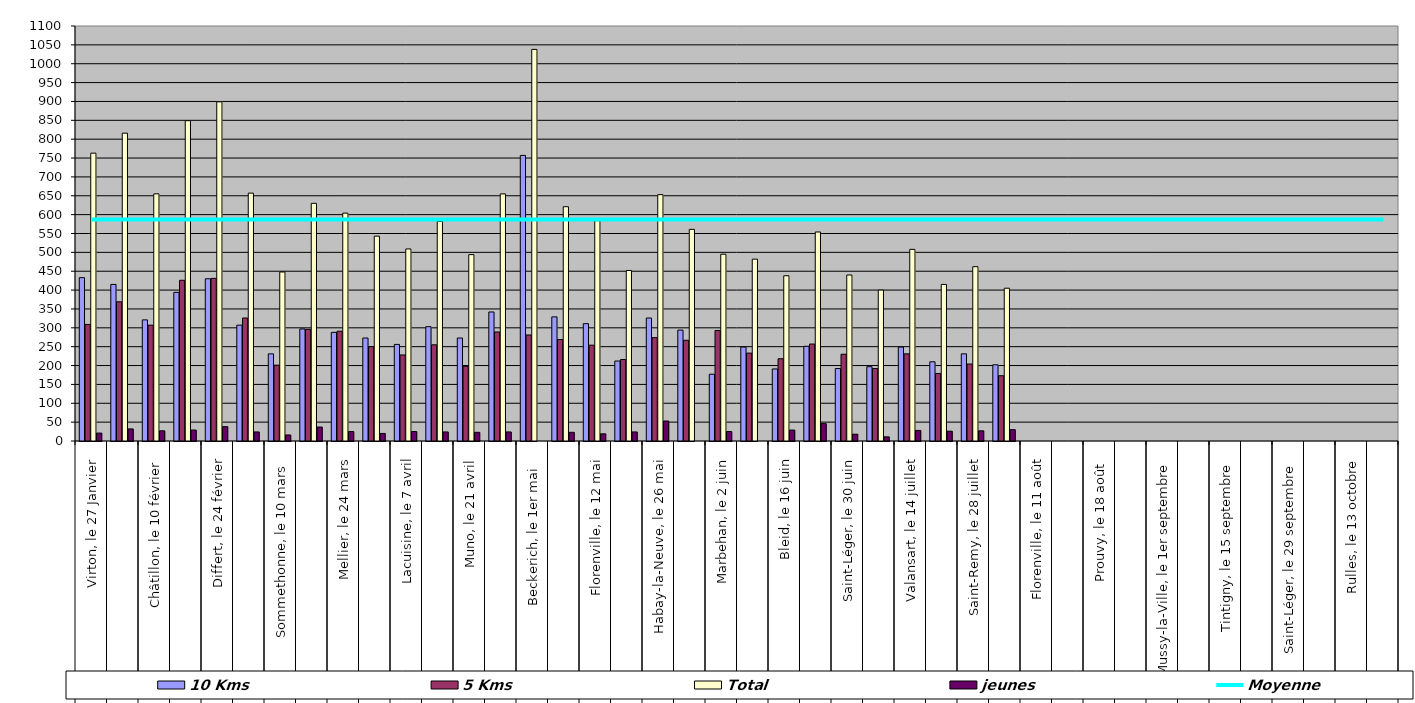
| Category | 10 Kms | 5 Kms | Total | jeunes |
|---|---|---|---|---|
| 0 | 433 | 309 | 763 | 21 |
| 1 | 415 | 369 | 816 | 32 |
| 2 | 321 | 307 | 655 | 27 |
| 3 | 394 | 426 | 849 | 29 |
| 4 | 430 | 431 | 899 | 38 |
| 5 | 307 | 326 | 657 | 24 |
| 6 | 231 | 201 | 448 | 16 |
| 7 | 297 | 296 | 630 | 37 |
| 8 | 288 | 291 | 604 | 25 |
| 9 | 273 | 250 | 543 | 20 |
| 10 | 256 | 228 | 509 | 25 |
| 11 | 303 | 255 | 582 | 24 |
| 12 | 273 | 198 | 494 | 23 |
| 13 | 342 | 289 | 655 | 24 |
| 14 | 757 | 281 | 1038 | 0 |
| 15 | 329 | 269 | 621 | 23 |
| 16 | 311 | 254 | 584 | 19 |
| 17 | 212 | 216 | 452 | 24 |
| 18 | 326 | 274 | 653 | 53 |
| 19 | 294 | 267 | 561 | 0 |
| 20 | 177 | 293 | 495 | 25 |
| 21 | 249 | 233 | 482 | 0 |
| 22 | 191 | 218 | 438 | 29 |
| 23 | 251 | 257 | 554 | 46 |
| 24 | 192 | 230 | 440 | 18 |
| 25 | 197 | 192 | 400 | 11 |
| 26 | 249 | 231 | 508 | 28 |
| 27 | 210 | 179 | 415 | 26 |
| 28 | 231 | 204 | 462 | 27 |
| 29 | 202 | 173 | 405 | 30 |
| 30 | 0 | 0 | 0 | 0 |
| 31 | 0 | 0 | 0 | 0 |
| 32 | 0 | 0 | 0 | 0 |
| 33 | 0 | 0 | 0 | 0 |
| 34 | 0 | 0 | 0 | 0 |
| 35 | 0 | 0 | 0 | 0 |
| 36 | 0 | 0 | 0 | 0 |
| 37 | 0 | 0 | 0 | 0 |
| 38 | 0 | 0 | 0 | 0 |
| 39 | 0 | 0 | 0 | 0 |
| 40 | 0 | 0 | 0 | 0 |
| 41 | 0 | 0 | 0 | 0 |